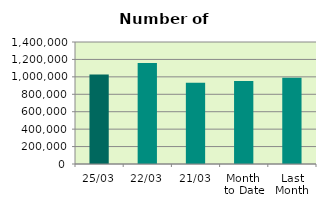
| Category | Series 0 |
|---|---|
| 25/03 | 1026724 |
| 22/03 | 1158972 |
| 21/03 | 931962 |
| Month 
to Date | 951786.824 |
| Last
Month | 989849.1 |